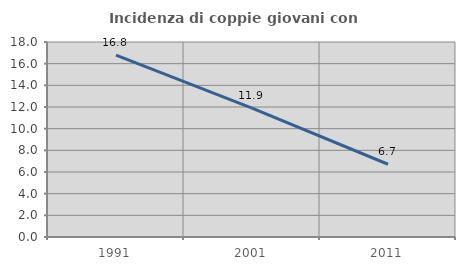
| Category | Incidenza di coppie giovani con figli |
|---|---|
| 1991.0 | 16.79 |
| 2001.0 | 11.89 |
| 2011.0 | 6.716 |